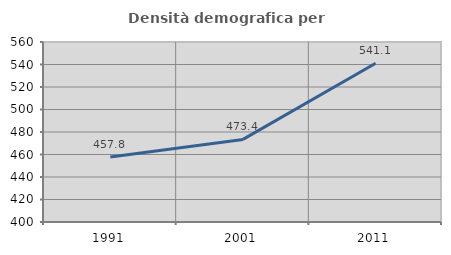
| Category | Densità demografica |
|---|---|
| 1991.0 | 457.83 |
| 2001.0 | 473.417 |
| 2011.0 | 541.072 |